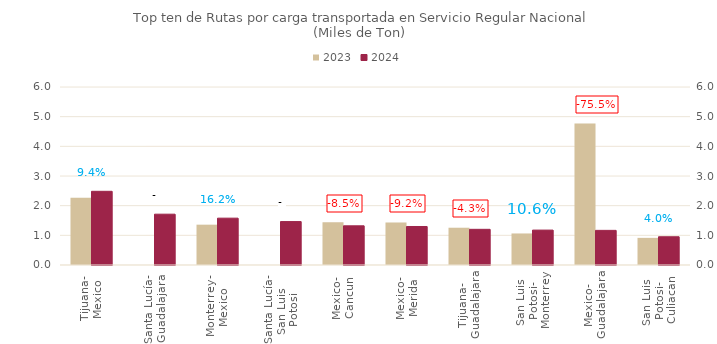
| Category | 2023 | 2024 |
|---|---|---|
| Tijuana-
Mexico | 2270.122 | 2484.052 |
| Santa Lucía-
Guadalajara | 0 | 1713.141 |
| Monterrey-
Mexico | 1359.212 | 1578.844 |
| Santa Lucía-
San Luis 
Potosi | 0 | 1463.477 |
| Mexico-
Cancun | 1444.792 | 1321.358 |
| Mexico-
Merida | 1430.366 | 1298.117 |
| Tijuana-
Guadalajara | 1256.837 | 1202.925 |
| San Luis 
Potosi-
Monterrey | 1063.215 | 1176.414 |
| Mexico-
Guadalajara | 4772.406 | 1167.143 |
| San Luis 
Potosi-
Culiacan | 915.19 | 952.079 |